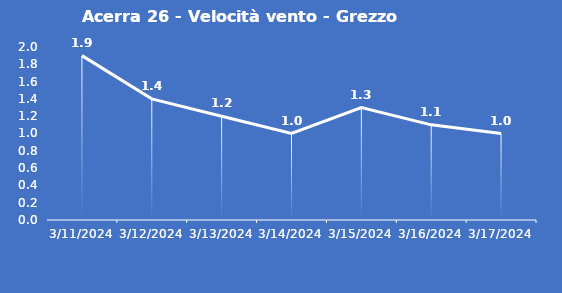
| Category | Acerra 26 - Velocità vento - Grezzo (m/s) |
|---|---|
| 3/11/24 | 1.9 |
| 3/12/24 | 1.4 |
| 3/13/24 | 1.2 |
| 3/14/24 | 1 |
| 3/15/24 | 1.3 |
| 3/16/24 | 1.1 |
| 3/17/24 | 1 |